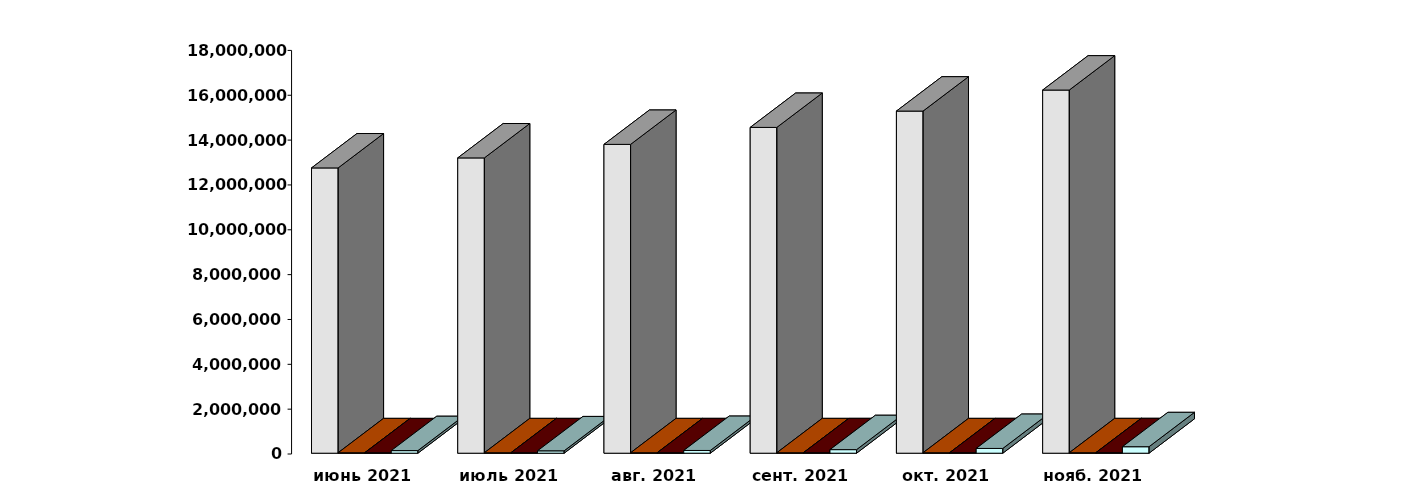
| Category | Физические лица | Юридические лица | Иностранные лица | Клиенты, передавшие свои средства в ДУ |
|---|---|---|---|---|
| 2021-06-30 | 12722884 | 19751 | 19280 | 115649 |
| 2021-07-30 | 13169586 | 19875 | 19720 | 105728 |
| 2021-08-30 | 13773190 | 19995 | 20283 | 122307 |
| 2021-09-30 | 14530193 | 20081 | 21060 | 158895 |
| 2021-10-30 | 15258509 | 20154 | 21894 | 212008 |
| 2021-11-30 | 16196130 | 20272 | 22719 | 288895 |